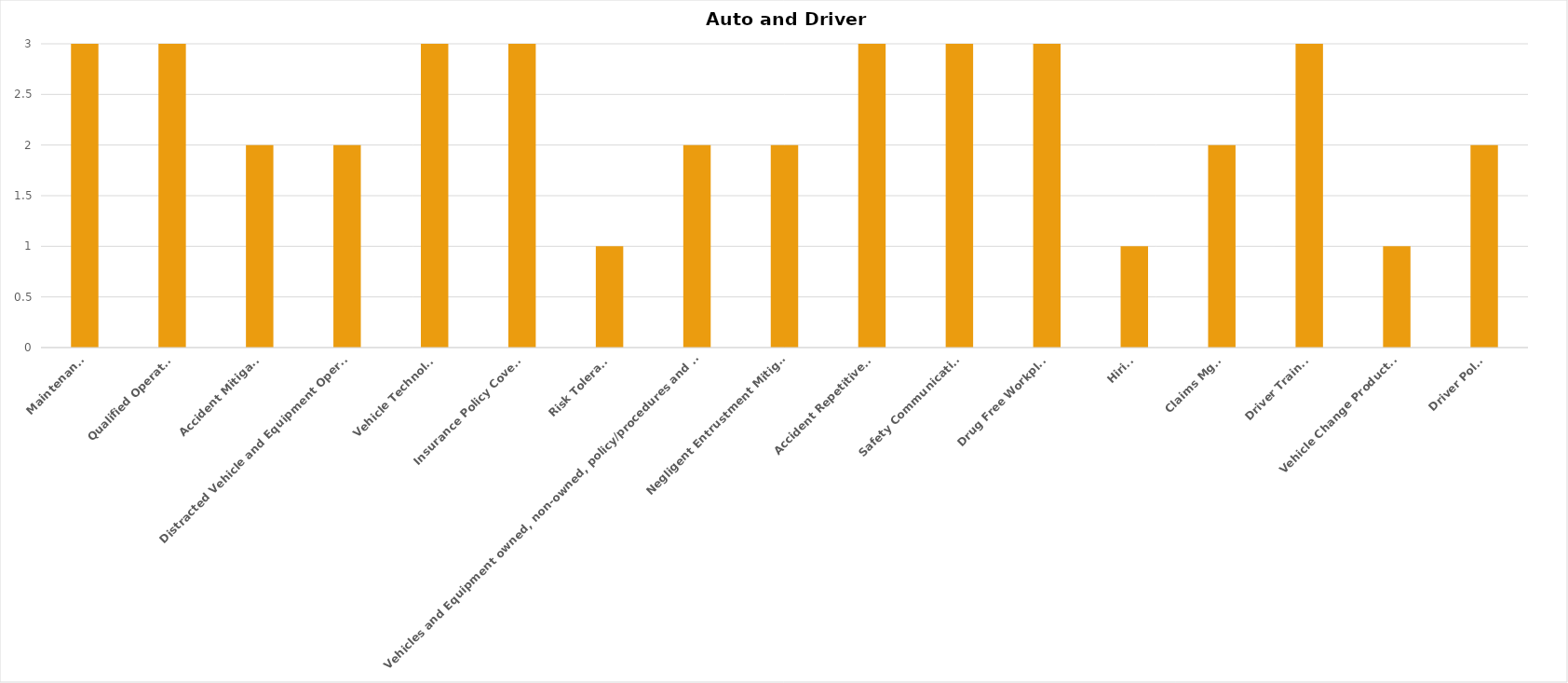
| Category | Series 0 |
|---|---|
| Maintenance | 3 |
| Qualified Operators | 3 |
| Accident Mitigation | 2 |
| Distracted Vehicle and Equipment Operations | 2 |
| Vehicle Technology | 3 |
| Insurance Policy Coverage | 3 |
| Risk Tolerance | 1 |
| Vehicles and Equipment owned, non-owned, policy/procedures and coverage | 2 |
| Negligent Entrustment Mitigation | 2 |
| Accident Repetitiveness | 3 |
| Safety Communications | 3 |
| Drug Free Workplace | 3 |
| Hiring | 1 |
| Claims Mgmt | 2 |
| Driver Training | 3 |
| Vehicle Change Productivity | 1 |
| Driver Policy | 2 |